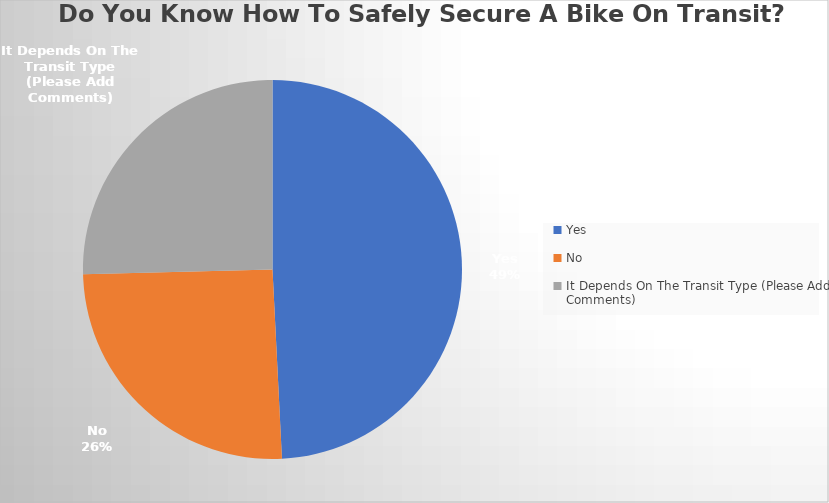
| Category | Series 0 |
|---|---|
| Yes | 31 |
| No | 16 |
| It Depends On The Transit Type (Please Add Comments) | 16 |